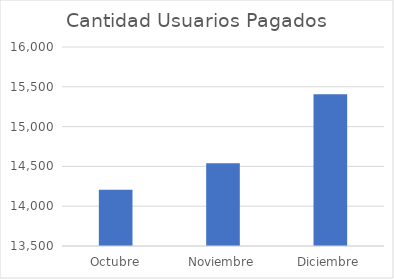
| Category | Cantidad Usuarios Pagados |
|---|---|
| Octubre | 14208 |
| Noviembre | 14540 |
| Diciembre | 15407 |